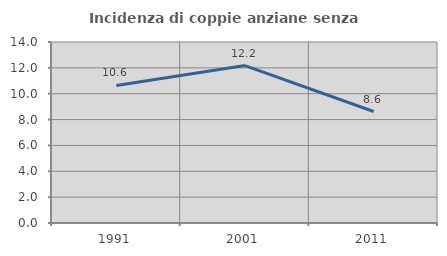
| Category | Incidenza di coppie anziane senza figli  |
|---|---|
| 1991.0 | 10.643 |
| 2001.0 | 12.176 |
| 2011.0 | 8.624 |